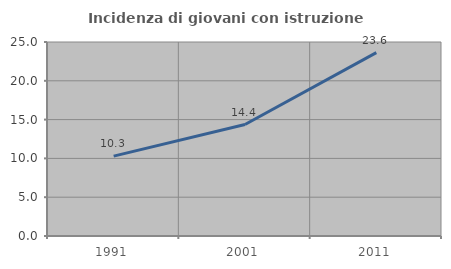
| Category | Incidenza di giovani con istruzione universitaria |
|---|---|
| 1991.0 | 10.289 |
| 2001.0 | 14.368 |
| 2011.0 | 23.629 |